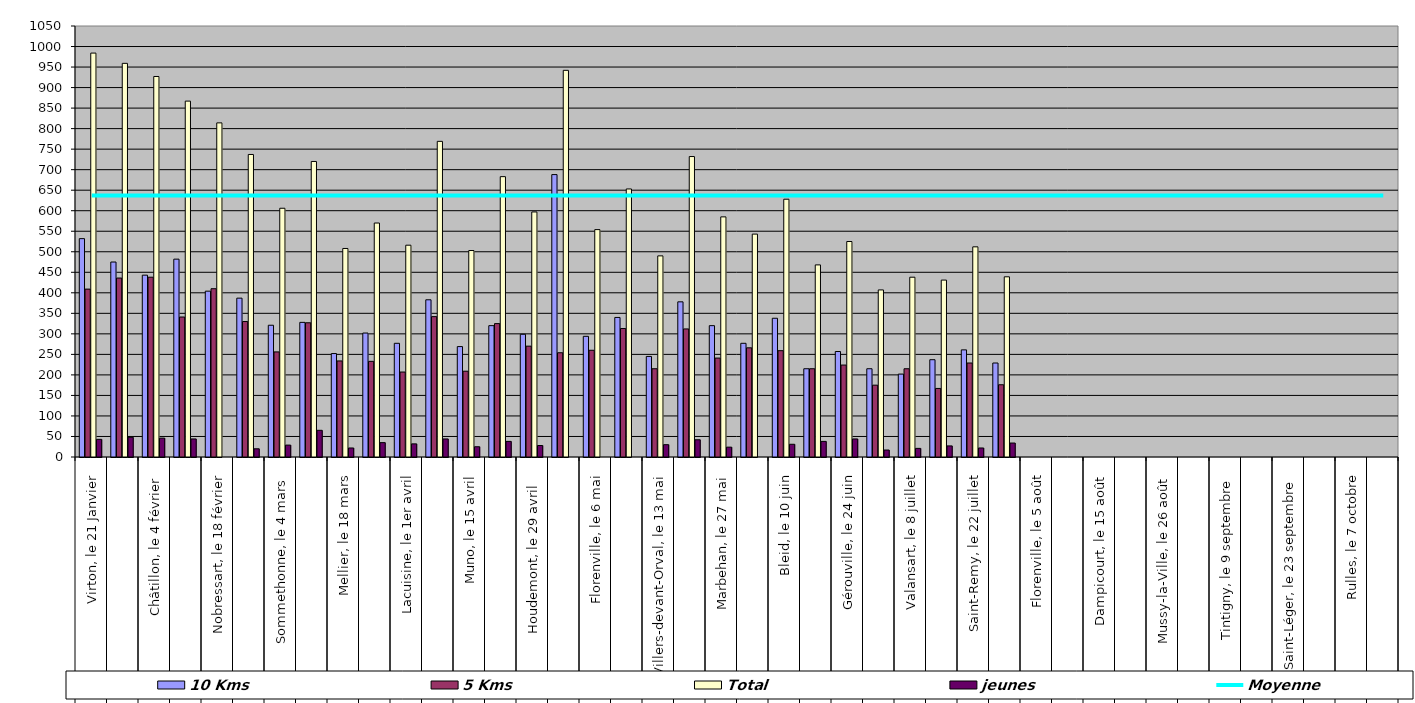
| Category | 10 Kms | 5 Kms | Total | jeunes |
|---|---|---|---|---|
| 0 | 532 | 409 | 984 | 43 |
| 1 | 475 | 436 | 959 | 48 |
| 2 | 443 | 438 | 927 | 46 |
| 3 | 482 | 341 | 867 | 44 |
| 4 | 404 | 410 | 814 | 0 |
| 5 | 387 | 330 | 737 | 20 |
| 6 | 321 | 256 | 606 | 29 |
| 7 | 328 | 327 | 720 | 65 |
| 8 | 252 | 234 | 508 | 22 |
| 9 | 302 | 233 | 570 | 35 |
| 10 | 277 | 207 | 516 | 32 |
| 11 | 383 | 342 | 769 | 44 |
| 12 | 269 | 209 | 503 | 25 |
| 13 | 320 | 325 | 683 | 38 |
| 14 | 299 | 270 | 597 | 28 |
| 15 | 688 | 254 | 942 | 0 |
| 16 | 294 | 260 | 554 | 0 |
| 17 | 340 | 313 | 653 | 0 |
| 18 | 245 | 215 | 490 | 30 |
| 19 | 378 | 312 | 732 | 42 |
| 20 | 320 | 241 | 585 | 24 |
| 21 | 277 | 266 | 543 | 0 |
| 22 | 338 | 259 | 628 | 31 |
| 23 | 215 | 215 | 468 | 38 |
| 24 | 257 | 224 | 525 | 44 |
| 25 | 215 | 175 | 407 | 17 |
| 26 | 202 | 215 | 438 | 21 |
| 27 | 237 | 167 | 431 | 27 |
| 28 | 261 | 229 | 512 | 22 |
| 29 | 229 | 176 | 439 | 34 |
| 30 | 0 | 0 | 0 | 0 |
| 31 | 0 | 0 | 0 | 0 |
| 32 | 0 | 0 | 0 | 0 |
| 33 | 0 | 0 | 0 | 0 |
| 34 | 0 | 0 | 0 | 0 |
| 35 | 0 | 0 | 0 | 0 |
| 36 | 0 | 0 | 0 | 0 |
| 37 | 0 | 0 | 0 | 0 |
| 38 | 0 | 0 | 0 | 0 |
| 39 | 0 | 0 | 0 | 0 |
| 40 | 0 | 0 | 0 | 0 |
| 41 | 0 | 0 | 0 | 0 |